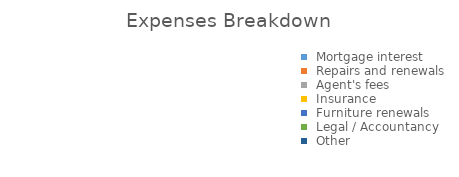
| Category | Series 0 |
|---|---|
| Mortgage interest | 0 |
| Repairs and renewals | 0 |
| Agent's fees | 0 |
| Insurance | 0 |
| Furniture renewals | 0 |
| Legal / Accountancy | 0 |
| Other | 0 |